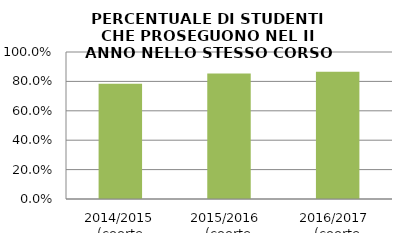
| Category | 2014/2015 (coorte 2013/14) 2015/2016  (coorte 2014/15) 2016/2017  (coorte 2015/16) |
|---|---|
| 2014/2015 (coorte 2013/14) | 0.785 |
| 2015/2016  (coorte 2014/15) | 0.854 |
| 2016/2017  (coorte 2015/16) | 0.866 |